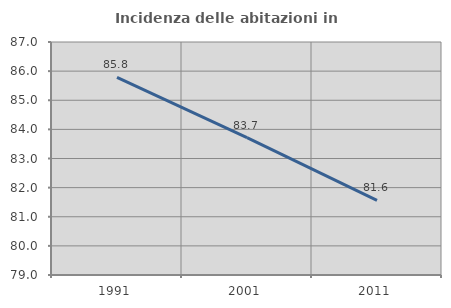
| Category | Incidenza delle abitazioni in proprietà  |
|---|---|
| 1991.0 | 85.783 |
| 2001.0 | 83.713 |
| 2011.0 | 81.565 |